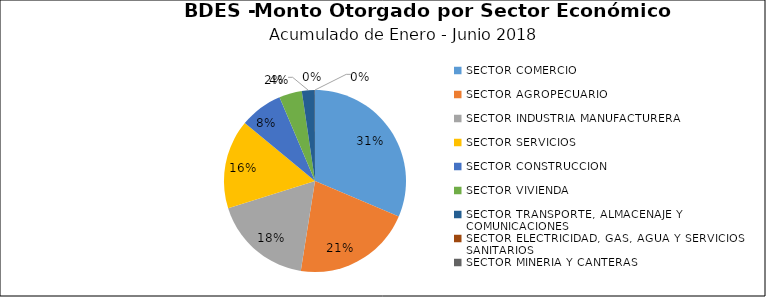
| Category | Monto | Créditos |
|---|---|---|
| SECTOR COMERCIO | 27.497 | 1539 |
| SECTOR AGROPECUARIO | 18.489 | 343 |
| SECTOR INDUSTRIA MANUFACTURERA | 15.478 | 395 |
| SECTOR SERVICIOS | 13.843 | 144 |
| SECTOR CONSTRUCCION | 6.699 | 299 |
| SECTOR VIVIENDA | 3.549 | 147 |
| SECTOR TRANSPORTE, ALMACENAJE Y COMUNICACIONES | 2.012 | 86 |
| SECTOR ELECTRICIDAD, GAS, AGUA Y SERVICIOS SANITARIOS | 0.023 | 2 |
| SECTOR MINERIA Y CANTERAS | 0.002 | 1 |